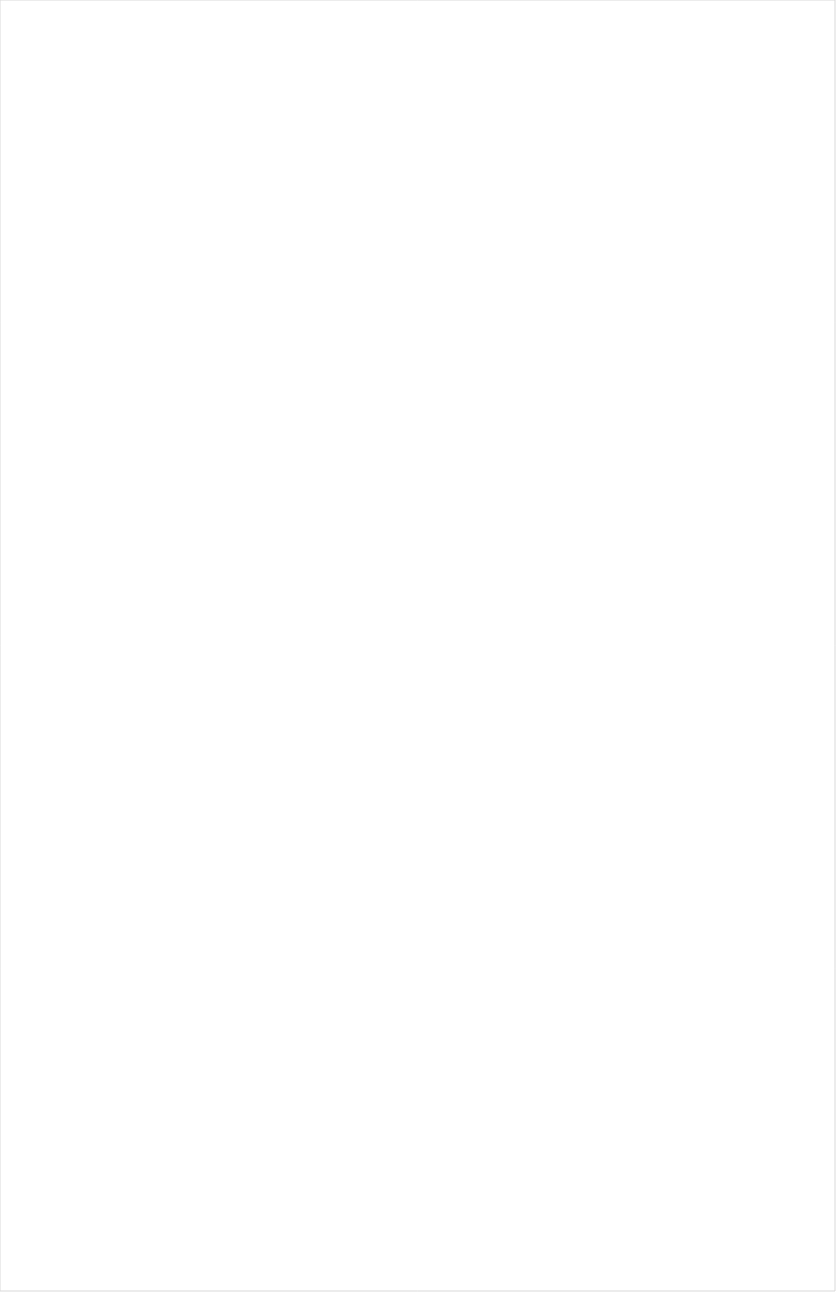
| Category | Total |
|---|---|
| Cartoon Network | -0.22 |
| TUDN | -0.215 |
| Nick Toons | -0.201 |
| Disney Channel | -0.197 |
| Nick Jr. | -0.189 |
| NBC Universo | -0.188 |
| VH1 | -0.188 |
| MTV2 | -0.186 |
| Nick | -0.186 |
| Disney Junior US | -0.183 |
| Universal Kids | -0.182 |
| Telemundo | -0.18 |
| Univision | -0.178 |
| Disney XD | -0.17 |
| UniMas | -0.167 |
| Adult Swim | -0.167 |
| Nick@Nite | -0.164 |
| MTV | -0.164 |
| truTV | -0.163 |
| Teen Nick | -0.155 |
| Galavision | -0.143 |
| Comedy Central | -0.132 |
| ESPN Deportes | -0.122 |
| TV ONE | -0.118 |
| BET | -0.112 |
| Viceland | -0.111 |
| Freeform | -0.105 |
| ESPN2 | -0.104 |
| ESPN | -0.101 |
| NBA TV | -0.1 |
| FXX | -0.099 |
| Logo | -0.087 |
| FX | -0.084 |
| Paramount Network | -0.084 |
| BET Her | -0.082 |
| ESPNEWS | -0.075 |
| TBS | -0.067 |
| E! | -0.053 |
| BRAVO | -0.049 |
| FX Movie Channel | -0.048 |
| Lifetime Movies | -0.042 |
| SYFY | -0.041 |
| MLB Network | -0.041 |
| TNT | -0.04 |
| Discovery Family Channel | -0.039 |
| A&E | -0.038 |
| TLC | -0.037 |
| NBC Sports | -0.036 |
| Independent Film (IFC) | -0.031 |
| ESPNU | -0.031 |
| USA Network | -0.026 |
| AMC | -0.024 |
| Lifetime | -0.021 |
| WE TV | -0.021 |
| Cooking Channel | -0.017 |
| Food Network | -0.016 |
| Discovery Channel | -0.012 |
| NFL Network | -0.005 |
| Oprah Winfrey Network | -0.001 |
| Discovery Life Channel | 0.001 |
| Travel | 0.001 |
| MyNetworkTV | 0.004 |
| Destination America | 0.006 |
| Investigation Discovery | 0.01 |
| CMTV | 0.013 |
| NHL | 0.013 |
| CNBC | 0.014 |
| BBC America | 0.015 |
| Motor Trend Network | 0.017 |
| OXYGEN | 0.022 |
| FYI | 0.023 |
| Olympic Channel | 0.023 |
| FOX | 0.024 |
| CW | 0.026 |
| Ovation | 0.026 |
| Reelz Channel | 0.035 |
| PAC-12 Network | 0.039 |
| Animal Planet | 0.042 |
| Science Channel | 0.05 |
| Golf | 0.05 |
| POP | 0.051 |
| CNN | 0.052 |
| Fox Sports 1 | 0.052 |
| FXDEP | 0.053 |
| The Sportsman Channel | 0.053 |
| National Geographic | 0.054 |
| HGTV | 0.054 |
| UP TV | 0.055 |
| ION | 0.062 |
| DIY | 0.063 |
| FOX Sports 2 | 0.065 |
| ABC | 0.066 |
| Great American Country | 0.068 |
| Big Ten Network | 0.068 |
| Game Show | 0.068 |
| NBC | 0.069 |
| TV LAND | 0.069 |
| Headline News | 0.071 |
| WGN America | 0.073 |
| History Channel | 0.076 |
| SundanceTV | 0.079 |
| Outdoor Channel | 0.079 |
| CBS Sports | 0.083 |
| National Geographic Wild | 0.083 |
| American Heroes Channel | 0.088 |
| Weather Channel | 0.107 |
| CBS | 0.13 |
| Fox News | 0.14 |
| Tennis Channel | 0.145 |
| Bloomberg HD | 0.152 |
| Hallmark | 0.157 |
| Smithsonian | 0.163 |
| MSNBC | 0.193 |
| Fox Business | 0.237 |
| Hallmark Movies & Mysteries | 0.237 |
| INSP | 0.24 |
| RFD TV | 0.259 |
| PBS | 0.311 |